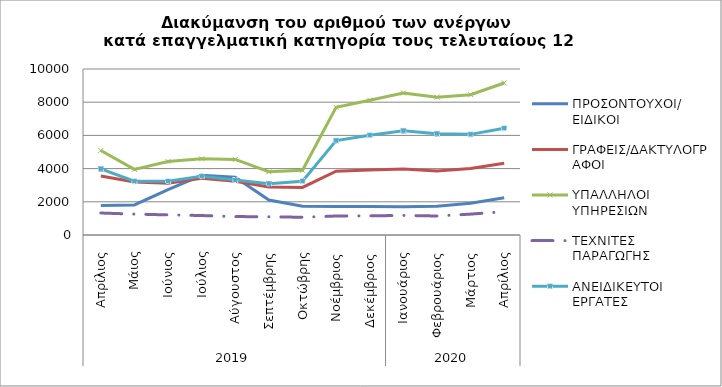
| Category | ΠΡΟΣΟΝΤΟΥΧΟΙ/  ΕΙΔΙΚΟΙ | ΓΡΑΦΕΙΣ/ΔΑΚΤΥΛΟΓΡΑΦΟΙ | ΥΠΑΛΛΗΛΟΙ ΥΠΗΡΕΣΙΩΝ | ΤΕΧΝΙΤΕΣ ΠΑΡΑΓΩΓΗΣ | ΑΝΕΙΔΙΚΕΥΤΟΙ ΕΡΓΑΤΕΣ |
|---|---|---|---|---|---|
| 0 | 1782 | 3556 | 5094 | 1323 | 3981 |
| 1 | 1813 | 3199 | 3952 | 1260 | 3240 |
| 2 | 2731 | 3112 | 4425 | 1211 | 3242 |
| 3 | 3596 | 3417 | 4589 | 1173 | 3539 |
| 4 | 3481 | 3236 | 4551 | 1111 | 3312 |
| 5 | 2104 | 2890 | 3809 | 1097 | 3094 |
| 6 | 1735 | 2865 | 3896 | 1068 | 3242 |
| 7 | 1719 | 3843 | 7692 | 1144 | 5690 |
| 8 | 1724 | 3914 | 8117 | 1155 | 6012 |
| 9 | 1702 | 3980 | 8556 | 1179 | 6279 |
| 10 | 1728 | 3859 | 8305 | 1145 | 6104 |
| 11 | 1918 | 4001 | 8454 | 1258 | 6062 |
| 12 | 2246 | 4325 | 9159 | 1405 | 6433 |